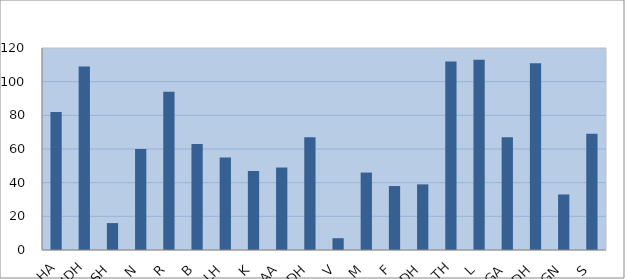
| Category | Series 0 |
|---|---|
| HA | 82 |
| HDH | 109 |
| SH | 16 |
| N | 60 |
| R | 94 |
| B | 63 |
| LH | 55 |
| K | 47 |
| AA | 49 |
| ADH | 67 |
| V | 7 |
| M | 46 |
| F | 38 |
| DH | 39 |
| TH | 112 |
| L | 113 |
| GA | 67 |
| GDH | 111 |
| GN | 33 |
| S | 69 |